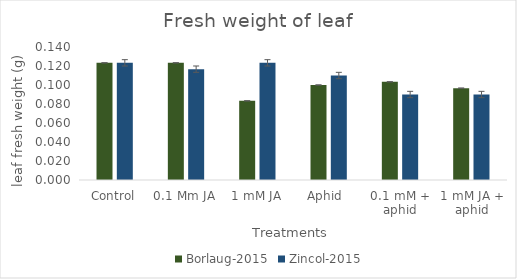
| Category | Borlaug-2015 | Zincol-2015 |
|---|---|---|
| Control | 0.123 | 0.123 |
| 0.1 Mm JA | 0.123 | 0.117 |
| 1 mM JA | 0.083 | 0.123 |
| Aphid  | 0.1 | 0.11 |
| 0.1 mM + aphid | 0.103 | 0.09 |
| 1 mM JA + aphid | 0.097 | 0.09 |